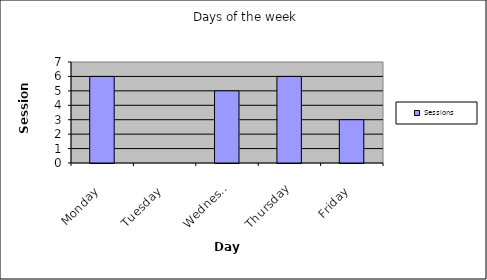
| Category | Sessions |
|---|---|
| Monday | 6 |
| Tuesday | 0 |
| Wednesday | 5 |
| Thursday | 6 |
| Friday | 3 |